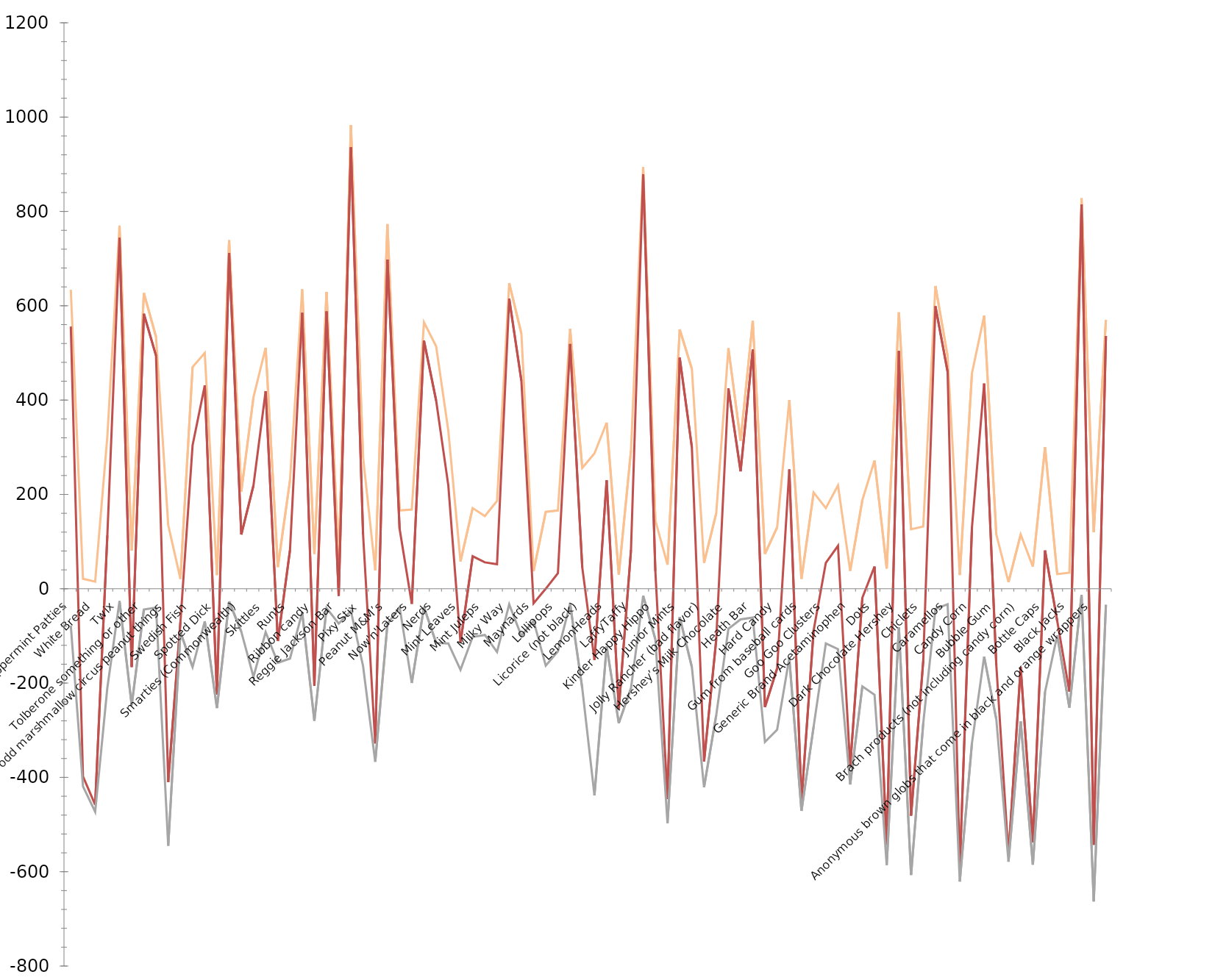
| Category | JOY | NET FEELIES | DESPAIR (NEG) |
|---|---|---|---|
| York Peppermint Patties | 634 | 556 | -78 |
| Whole Wheat anything | 21 | -398 | -419 |
| White Bread | 15 | -458 | -473 |
| Vicodin | 323 | 113 | -210 |
| Twix | 770 | 744 | -26 |
| Trail Mix | 81 | -166 | -247 |
| Tolberone something or other | 627 | 583 | -44 |
| Three Musketeers | 534 | 494 | -40 |
| Those odd marshmallow circus peanut things | 135 | -410 | -545 |
| Sweetums | 21 | -71 | -92 |
| Swedish Fish | 470 | 304 | -166 |
| Starburst | 500 | 431 | -69 |
| Spotted Dick | 29 | -224 | -253 |
| Snickers | 739 | 712 | -27 |
| Smarties (Commonwealth) | 206 | 115 | -91 |
| Smarties (American) | 406 | 219 | -187 |
| Skittles | 511 | 419 | -92 |
| Senior Mints | 46 | -111 | -157 |
| Runts | 230 | 82 | -148 |
| Rolos | 635 | 585 | -50 |
| Ribbon candy | 74 | -206 | -280 |
| Regular M&Ms | 629 | 588 | -41 |
| Reggie Jackson Bar | 59 | -15 | -74 |
| Reese’s Peanut Butter Cups | 983 | 936 | -47 |
| Pixy Stix | 279 | 115 | -164 |
| Pencils | 39 | -328 | -367 |
| Peanut M&M’s | 773 | 698 | -75 |
| Other | 166 | 127 | -39 |
| Now'n'Laters | 168 | -32 | -200 |
| Nestle Crunch | 565 | 526 | -39 |
| Nerds | 514 | 399 | -115 |
| Mint M&Ms | 335 | 219 | -116 |
| Mint Leaves | 58 | -114 | -172 |
| Mint Kisses | 171 | 69 | -102 |
| Mint Juleps | 154 | 56 | -98 |
| Minibags of chips | 186 | 52 | -134 |
| Milky Way | 648 | 615 | -33 |
| Milk Duds | 541 | 441 | -100 |
| Maynards | 37 | -31 | -68 |
| Mary Janes | 163 | 0 | -163 |
| Lollipops | 166 | 33 | -133 |
| Lindt Truffle | 551 | 519 | -32 |
| Licorice (not black) | 256 | 45 | -211 |
| Licorice | 287 | -151 | -438 |
| LemonHeads | 352 | 230 | -122 |
| Lapel Pins | 30 | -255 | -285 |
| LaffyTaffy | 293 | 82 | -211 |
| Kit Kat | 894 | 879 | -15 |
| Kinder Happy Hippo | 145 | 38 | -107 |
| Kale smoothie | 51 | -446 | -497 |
| Junior Mints | 550 | 490 | -60 |
| Jolly Ranchers (good flavor) | 466 | 300 | -166 |
| Jolly Rancher (bad flavor) | 55 | -366 | -421 |
| Hugs (actual physical hugs) | 160 | -108 | -268 |
| Hershey’s Milk Chocolate | 510 | 425 | -85 |
| Hershey’s Kissables | 314 | 249 | -65 |
| Heath Bar | 568 | 507 | -61 |
| Healthy Fruit | 74 | -251 | -325 |
| Hard Candy | 130 | -169 | -299 |
| Gummy Bears straight up | 400 | 253 | -147 |
| Gum from baseball cards | 21 | -450 | -471 |
| Good N' Plenty | 204 | -88 | -292 |
| Goo Goo Clusters | 171 | 55 | -116 |
| Glow sticks | 219 | 91 | -128 |
| Generic Brand Acetaminophen | 38 | -377 | -415 |
| Fuzzy Peaches | 188 | -19 | -207 |
| Dots | 272 | 47 | -225 |
| Dental paraphenalia | 43 | -543 | -586 |
| Dark Chocolate Hershey | 586 | 504 | -82 |
| Creepy Religious comics/Chick Tracts | 126 | -481 | -607 |
| Chiclets | 132 | -153 | -285 |
| Cash, or other forms of legal tender | 642 | 599 | -43 |
| Caramellos | 493 | 460 | -33 |
| Candy that is clearly just the stuff given out for free at restaurants | 29 | -592 | -621 |
| Candy Corn | 457 | 130 | -327 |
| Cadbury Creme Eggs | 579 | 435 | -144 |
| Bubble Gum | 115 | -162 | -277 |
| Broken glow stick | 14 | -565 | -579 |
| Brach products (not including candy corn) | 115 | -166 | -281 |
| Box’o’ Raisins | 47 | -538 | -585 |
| Bottle Caps | 300 | 81 | -219 |
| Bonkers | 31 | -68 | -99 |
| Black Jacks | 34 | -218 | -252 |
| Any full-sized candy bar | 828 | 815 | -13 |
| Anonymous brown globs that come in black and orange wrappers | 120 | -543 | -663 |
| 100 Grand Bar | 570 | 536 | -34 |